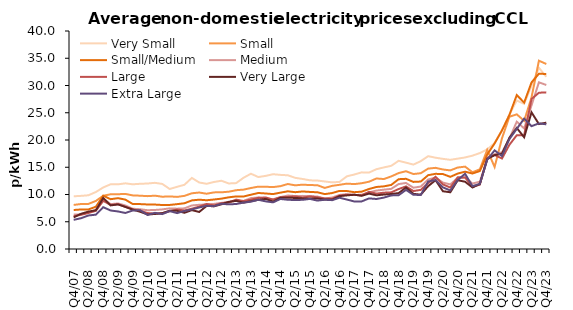
| Category | Very Small | Small | Small/Medium | Medium | Large | Very Large | Extra Large |
|---|---|---|---|---|---|---|---|
| Q4/07  | 9.671 | 8.088 | 7.155 | 6.318 | 6.014 | 5.809 | 5.354 |
| Q1/08  | 9.75 | 8.257 | 7.257 | 6.366 | 6.281 | 6.461 | 5.647 |
| Q2/08  | 9.862 | 8.275 | 7.26 | 6.728 | 6.609 | 6.86 | 6.153 |
| Q3/08  | 10.453 | 8.815 | 7.757 | 7.175 | 7.01 | 7.109 | 6.3 |
| Q4/08  | 11.292 | 9.771 | 9.773 | 9.227 | 8.841 | 9.362 | 7.672 |
| Q1/09  | 11.874 | 10.039 | 9.136 | 8.237 | 8.077 | 7.998 | 7.065 |
| Q2/09  | 11.864 | 10.051 | 9.329 | 8.359 | 8.228 | 8.183 | 6.889 |
| Q3/09  | 12.051 | 10.106 | 9.058 | 7.984 | 7.729 | 7.722 | 6.61 |
| Q4/09  | 11.87 | 9.837 | 8.25 | 7.396 | 7.257 | 7.23 | 7.06 |
| Q1/10  | 11.965 | 9.78 | 8.24 | 7.297 | 7.043 | 6.834 | 7.112 |
| Q2/10  | 12.017 | 9.7 | 8.171 | 7.115 | 6.593 | 6.338 | 6.242 |
| Q3/10  | 12.142 | 9.785 | 8.154 | 7.163 | 6.497 | 6.425 | 6.635 |
| Q4/10  | 11.938 | 9.593 | 8.072 | 7.269 | 6.561 | 6.569 | 6.398 |
| Q1/11  | 11.01 | 9.654 | 8.085 | 7.456 | 6.927 | 7.026 | 6.957 |
| Q2/11  | 11.409 | 9.56 | 8.229 | 7.402 | 7.24 | 7.006 | 6.583 |
| Q3/11  | 11.785 | 9.751 | 8.393 | 7.46 | 7.07 | 6.642 | 6.982 |
| Q4/11  | 13.043 | 10.222 | 8.917 | 7.989 | 7.39 | 7.139 | 7.255 |
| Q1/12  | 12.203 | 10.363 | 9.048 | 8.113 | 7.779 | 6.8 | 7.623 |
| Q2/12  | 11.964 | 10.14 | 8.945 | 8.176 | 8.263 | 7.908 | 7.925 |
| Q3/12  | 12.296 | 10.388 | 9.08 | 8.275 | 7.99 | 7.839 | 7.858 |
| Q4/12  | 12.525 | 10.401 | 9.238 | 8.456 | 8.409 | 8.197 | 8.294 |
| Q1/13  | 12.026 | 10.516 | 9.482 | 8.621 | 8.552 | 8.654 | 8.191 |
| Q2/13  | 12.09 | 10.789 | 9.647 | 8.823 | 9.058 | 8.836 | 8.257 |
| Q3/13  | 13.071 | 10.894 | 9.634 | 8.824 | 8.795 | 8.505 | 8.512 |
| Q4/13  | 13.813 | 11.189 | 9.959 | 9.338 | 9.055 | 8.773 | 8.68 |
| Q1/14  | 13.204 | 11.444 | 10.279 | 9.456 | 9.387 | 9.018 | 9.032 |
| Q2/14  | 13.416 | 11.424 | 10.188 | 9.298 | 9.457 | 9.189 | 8.742 |
| Q3/14  | 13.723 | 11.359 | 10.076 | 9.121 | 9.062 | 8.702 | 8.558 |
| Q4/14  | 13.601 | 11.532 | 10.342 | 9.521 | 9.503 | 9.393 | 9.177 |
| Q1/15  | 13.526 | 11.924 | 10.587 | 9.814 | 9.558 | 9.395 | 9.034 |
| Q2/15  | 13.056 | 11.681 | 10.424 | 9.717 | 9.655 | 9.374 | 8.981 |
| Q3/15  | 12.851 | 11.806 | 10.559 | 9.748 | 9.412 | 9.279 | 9.027 |
| Q4/15  | 12.6 | 11.731 | 10.474 | 9.699 | 9.659 | 9.267 | 9.187 |
| Q1/16  | 12.562 | 11.707 | 10.406 | 9.627 | 9.477 | 9.273 | 8.881 |
| Q2/16  | 12.394 | 11.207 | 10.07 | 9.267 | 9.275 | 9.067 | 9.038 |
| Q3/16  | 12.225 | 11.585 | 10.267 | 9.438 | 9.226 | 9.061 | 8.962 |
| Q4/16  | 12.313 | 11.779 | 10.665 | 9.921 | 9.794 | 9.707 | 9.411 |
| Q1/17  | 13.339 | 11.997 | 10.63 | 10.062 | 9.975 | 9.837 | 9.069 |
| Q2/17  | 13.668 | 11.911 | 10.426 | 9.901 | 9.957 | 9.958 | 8.72 |
| Q3/17  | 14.062 | 12.069 | 10.521 | 9.961 | 9.835 | 9.766 | 8.734 |
| Q4/17  | 14.028 | 12.348 | 11.013 | 10.395 | 10.489 | 10.165 | 9.287 |
| Q1/18  | 14.644 | 12.942 | 11.382 | 10.719 | 10.161 | 9.849 | 9.176 |
| Q2/18  | 14.968 | 12.836 | 11.495 | 10.888 | 10.334 | 9.996 | 9.429 |
| Q3/18  | 15.262 | 13.32 | 11.754 | 11.034 | 10.394 | 10.088 | 9.833 |
| Q4/18  | 16.18 | 13.932 | 12.809 | 11.908 | 10.998 | 10.257 | 9.867 |
| Q1/19  | 15.847 | 14.269 | 12.877 | 12.118 | 11.489 | 11.282 | 10.843 |
| Q2/19  | 15.486 | 13.758 | 12.312 | 11.248 | 10.638 | 10.127 | 9.937 |
| Q3/19  | 16.12 | 13.906 | 12.377 | 11.459 | 10.846 | 9.965 | 9.924 |
| Q4/19  | 17.035 | 14.752 | 13.547 | 12.749 | 12.063 | 11.531 | 12.388 |
| Q1/20  | 16.749 | 14.892 | 13.792 | 13.094 | 13.247 | 12.627 | 12.655 |
| Q2/20  | 16.541 | 14.593 | 13.752 | 12.182 | 11.846 | 10.596 | 11.305 |
| Q3/20  | 16.366 | 14.424 | 13.237 | 11.852 | 11.277 | 10.413 | 10.74 |
| Q4/20  | 16.581 | 14.949 | 13.838 | 13.017 | 13.149 | 12.613 | 12.651 |
| Q1/21  | 16.796 | 15.115 | 14.185 | 13.123 | 13.134 | 12.346 | 13.801 |
| Q2/21  | 17.129 | 14.087 | 13.847 | 12.009 | 11.397 | 11.288 | 11.524 |
| Q3/21  | 17.601 | 14.621 | 14.312 | 12.35 | 11.814 | 11.937 | 11.958 |
| Q4/21  | 18.27 | 18.196 | 17.335 | 16.514 | 16.741 | 16.509 | 16.38 |
| Q1/22  | 19.436 | 15.051 | 19.386 | 17.385 | 17.26 | 17.225 | 18.096 |
| Q2/22  | 21.786 | 20.324 | 21.768 | 17.746 | 16.598 | 17.493 | 17.05 |
| Q3/22  | 24.648 | 24.269 | 24.584 | 20.226 | 19.117 | 20.408 | 20.166 |
| Q4/22  | 27.247 | 24.71 | 28.238 | 23.361 | 20.874 | 22.207 | 22.045 |
| Q1/23  | 26.629 | 23.516 | 26.86 | 22.122 | 20.885 | 20.502 | 23.923 |
| Q2/23  | 29.959 | 27.818 | 30.565 | 26.355 | 27.527 | 25.072 | 22.537 |
| Q3/23  | 33.25 | 34.551 | 32.164 | 30.583 | 28.672 | 22.919 | 23.052 |
| Q4/23  | 31.596 | 33.949 | 32.109 | 30.094 | 28.74 | 23.183 | 22.876 |